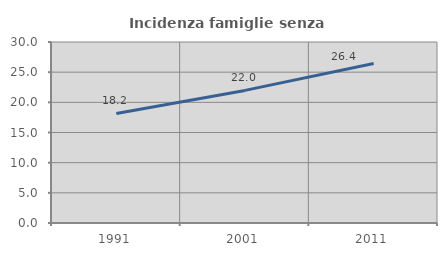
| Category | Incidenza famiglie senza nuclei |
|---|---|
| 1991.0 | 18.153 |
| 2001.0 | 21.977 |
| 2011.0 | 26.433 |